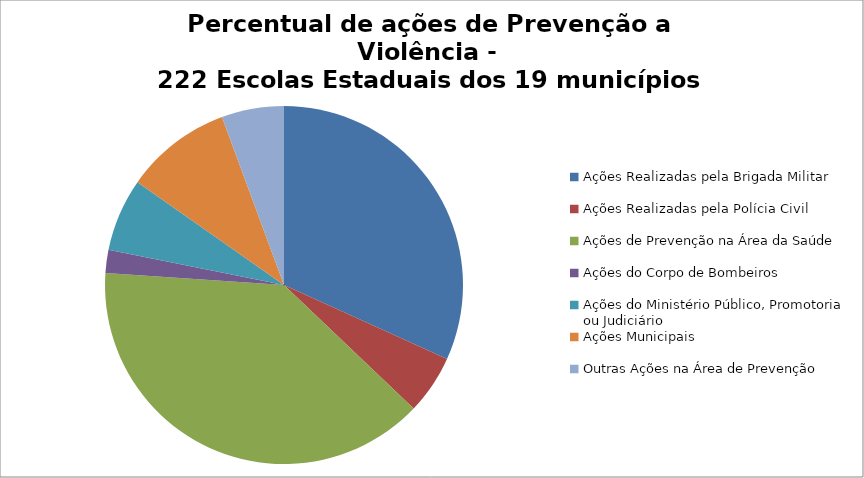
| Category | Percentual |
|---|---|
| Ações Realizadas pela Brigada Militar | 0.318 |
| Ações Realizadas pela Polícia Civil | 0.053 |
| Ações de Prevenção na Área da Saúde | 0.39 |
| Ações do Corpo de Bombeiros | 0.021 |
| Ações do Ministério Público, Promotoria ou Judiciário | 0.066 |
| Ações Municipais | 0.096 |
| Outras Ações na Área de Prevenção | 0.056 |